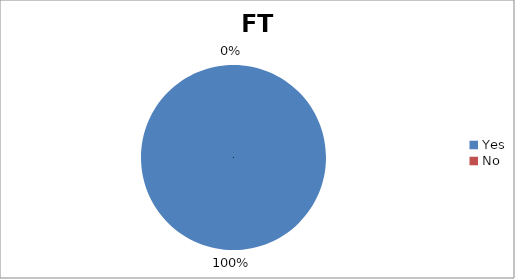
| Category | FT Resident |
|---|---|
| Yes | 13 |
| No | 0 |